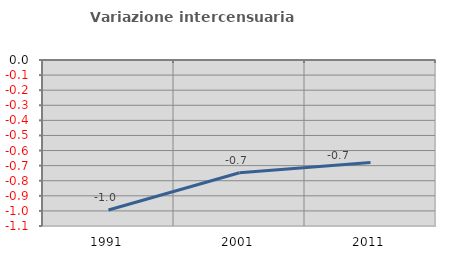
| Category | Variazione intercensuaria annua |
|---|---|
| 1991.0 | -0.994 |
| 2001.0 | -0.747 |
| 2011.0 | -0.678 |